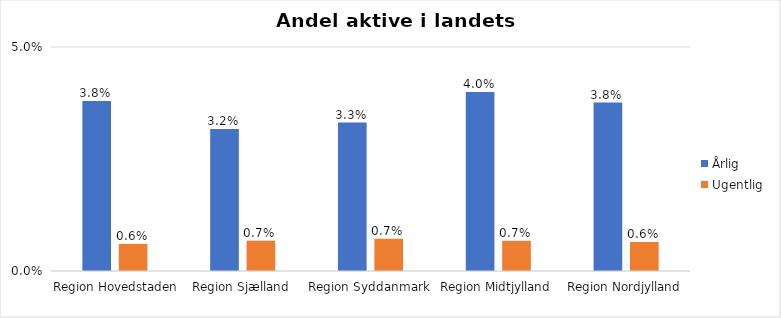
| Category | Årlig | Ugentlig |
|---|---|---|
| Region Hovedstaden | 0.038 | 0.006 |
| Region Sjælland | 0.032 | 0.007 |
| Region Syddanmark | 0.033 | 0.007 |
| Region Midtjylland | 0.04 | 0.007 |
| Region Nordjylland | 0.038 | 0.006 |